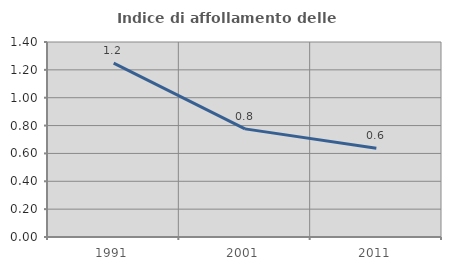
| Category | Indice di affollamento delle abitazioni  |
|---|---|
| 1991.0 | 1.248 |
| 2001.0 | 0.776 |
| 2011.0 | 0.637 |